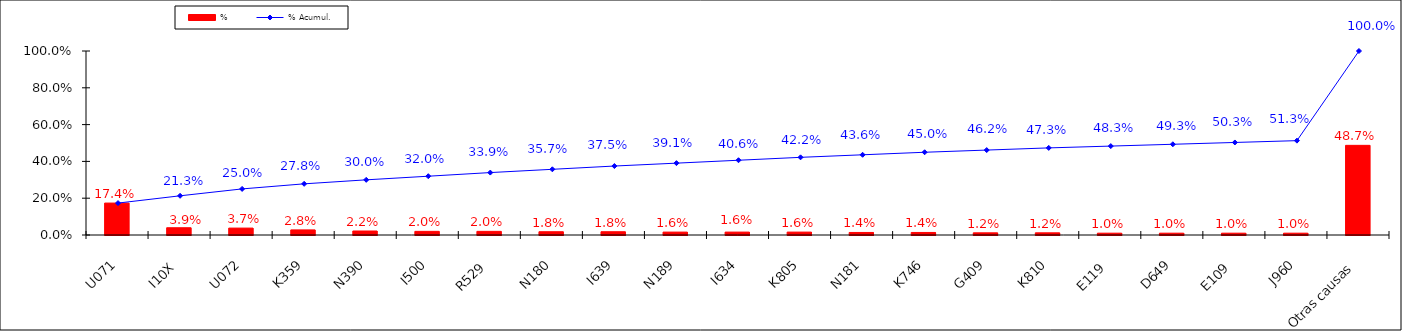
| Category | % |
|---|---|
| U071 | 0.174 |
| I10X | 0.039 |
| U072 | 0.037 |
| K359 | 0.028 |
| N390 | 0.022 |
| I500 | 0.02 |
| R529 | 0.02 |
| N180 | 0.018 |
| I639 | 0.018 |
| N189 | 0.016 |
| I634 | 0.016 |
| K805 | 0.016 |
| N181 | 0.014 |
| K746 | 0.014 |
| G409 | 0.012 |
| K810 | 0.012 |
| E119 | 0.01 |
| D649 | 0.01 |
| E109 | 0.01 |
| J960 | 0.01 |
| Otras causas | 0.487 |